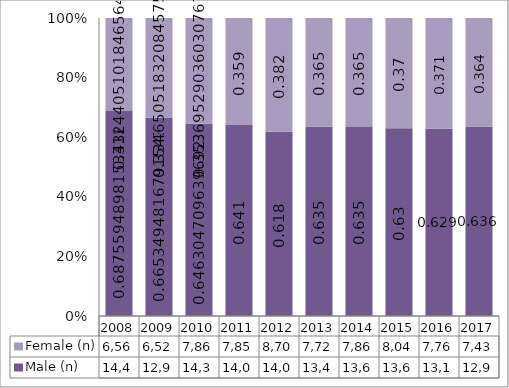
| Category | Male (n) | Female (n) |
|---|---|---|
| 2008.0 | 14447 | 6565 |
| 2009.0 | 12965 | 6521 |
| 2010.0 | 14368 | 7863 |
| 2011.0 | 14002 | 7854 |
| 2012.0 | 14080 | 8707 |
| 2013.0 | 13448 | 7725 |
| 2014.0 | 13654 | 7862 |
| 2015.0 | 13672 | 8042 |
| 2016.0 | 13145 | 7769 |
| 2017.0 | 12974 | 7434 |